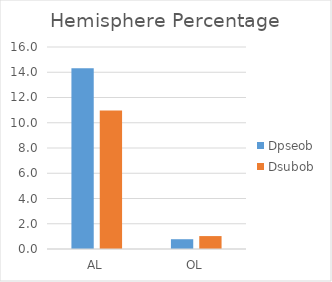
| Category | Dpseob | Dsubob |
|---|---|---|
| AL | 14.325 | 10.975 |
| OL | 0.775 | 1.023 |